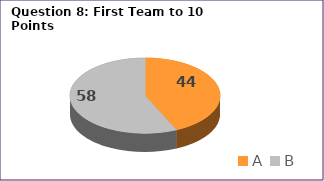
| Category | Series 0 |
|---|---|
| A | 44 |
| B | 58 |